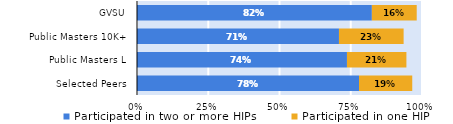
| Category | Participated in two or more HIPs | Participated in one HIP |
|---|---|---|
| Selected Peers | 0.779 | 0.187 |
| Public Masters L | 0.737 | 0.209 |
| Public Masters 10K+ | 0.709 | 0.227 |
| GVSU | 0.824 | 0.157 |